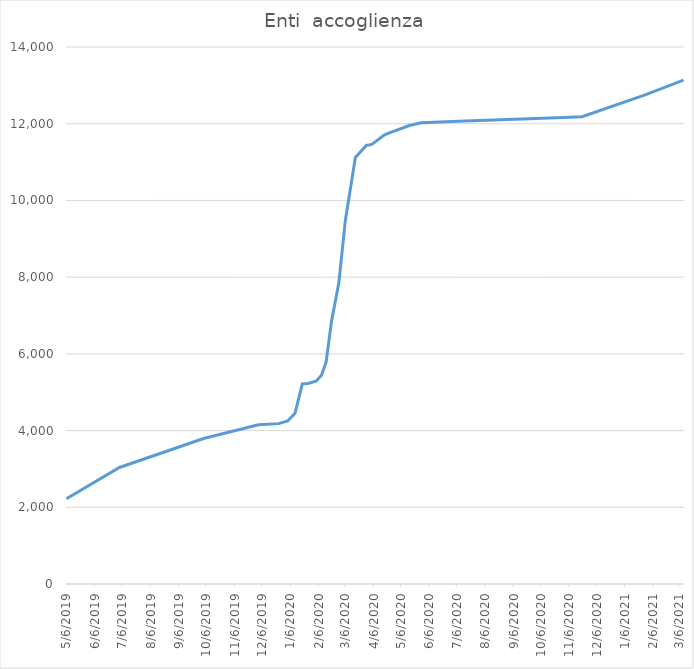
| Category | Enti  accoglienza |
|---|---|
| 5/6/19 | 2223 |
| 7/3/19 | 3038 |
| 10/3/19 | 3793 |
| 12/2/19 | 4149 |
| 12/24/19 | 4181 |
| 1/3/20 | 4249 |
| 1/11/20 | 4450 |
| 1/19/20 | 5214 |
| 1/25/20 | 5229 |
| 2/3/20 | 5285 |
| 2/9/20 | 5443 |
| 2/14/20 | 5787 |
| 2/20/20 | 6854 |
| 2/28/20 | 7861 |
| 3/6/20 | 9465 |
| 3/17/20 | 11122 |
| 3/29/20 | 11433 |
| 4/4/20 | 11460 |
| 4/18/20 | 11710 |
| 4/24/20 | 11770 |
| 5/15/20 | 11953 |
| 5/28/20 | 12025 |
| 7/15/20 | 12072 |
| 10/31/20 | 12161 |
| 11/20/20 | 12184 |
| 1/28/21 | 12752 |
| 3/11/21 | 13136 |